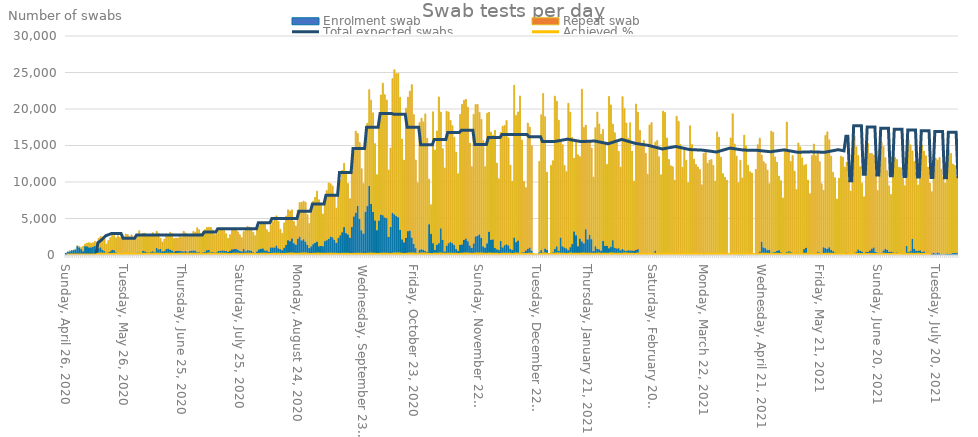
| Category | Enrolment swab | Repeat swab |
|---|---|---|
| 2020-04-26 | 223 | 0 |
| 2020-04-27 | 414 | 0 |
| 2020-04-28 | 518 | 5 |
| 2020-04-29 | 583 | 0 |
| 2020-04-30 | 655 | 0 |
| 2020-05-01 | 751 | 13 |
| 2020-05-02 | 1212 | 66 |
| 2020-05-03 | 1027 | 162 |
| 2020-05-04 | 804 | 214 |
| 2020-05-05 | 512 | 703 |
| 2020-05-06 | 1188 | 330 |
| 2020-05-07 | 1175 | 459 |
| 2020-05-08 | 1040 | 650 |
| 2020-05-09 | 1035 | 589 |
| 2020-05-10 | 1088 | 581 |
| 2020-05-11 | 1241 | 643 |
| 2020-05-12 | 614 | 1059 |
| 2020-05-13 | 918 | 1367 |
| 2020-05-14 | 1049 | 1489 |
| 2020-05-15 | 721 | 1739 |
| 2020-05-16 | 532 | 1622 |
| 2020-05-17 | 222 | 1270 |
| 2020-05-18 | 347 | 1622 |
| 2020-05-19 | 485 | 1894 |
| 2020-05-20 | 686 | 2251 |
| 2020-05-21 | 643 | 2018 |
| 2020-05-22 | 356 | 2006 |
| 2020-05-23 | 212 | 2442 |
| 2020-05-24 | 280 | 2123 |
| 2020-05-25 | 248 | 2157 |
| 2020-05-26 | 152 | 2306 |
| 2020-05-27 | 135 | 2749 |
| 2020-05-28 | 173 | 2625 |
| 2020-05-29 | 148 | 2360 |
| 2020-05-30 | 78 | 2680 |
| 2020-05-31 | 47 | 2282 |
| 2020-06-01 | 257 | 2071 |
| 2020-06-02 | 321 | 2353 |
| 2020-06-03 | 316 | 3009 |
| 2020-06-04 | 215 | 2571 |
| 2020-06-05 | 555 | 2410 |
| 2020-06-06 | 475 | 2525 |
| 2020-06-07 | 360 | 2303 |
| 2020-06-08 | 315 | 2445 |
| 2020-06-09 | 405 | 2382 |
| 2020-06-10 | 507 | 2539 |
| 2020-06-11 | 386 | 2195 |
| 2020-06-12 | 951 | 2302 |
| 2020-06-13 | 769 | 2185 |
| 2020-06-14 | 836 | 1446 |
| 2020-06-15 | 505 | 1272 |
| 2020-06-16 | 537 | 1629 |
| 2020-06-17 | 800 | 2066 |
| 2020-06-18 | 869 | 1928 |
| 2020-06-19 | 727 | 2388 |
| 2020-06-20 | 602 | 2306 |
| 2020-06-21 | 457 | 1792 |
| 2020-06-22 | 558 | 1776 |
| 2020-06-23 | 564 | 1751 |
| 2020-06-24 | 570 | 1988 |
| 2020-06-25 | 517 | 1921 |
| 2020-06-26 | 475 | 2770 |
| 2020-06-27 | 560 | 2446 |
| 2020-06-28 | 370 | 2177 |
| 2020-06-29 | 542 | 2066 |
| 2020-06-30 | 585 | 2280 |
| 2020-07-01 | 609 | 2624 |
| 2020-07-02 | 594 | 2541 |
| 2020-07-03 | 414 | 3314 |
| 2020-07-04 | 435 | 3031 |
| 2020-07-05 | 274 | 2722 |
| 2020-07-06 | 356 | 2819 |
| 2020-07-07 | 429 | 3031 |
| 2020-07-08 | 640 | 3138 |
| 2020-07-09 | 671 | 3120 |
| 2020-07-10 | 416 | 3357 |
| 2020-07-11 | 400 | 3032 |
| 2020-07-12 | 330 | 2449 |
| 2020-07-13 | 372 | 2567 |
| 2020-07-14 | 587 | 2726 |
| 2020-07-15 | 578 | 3039 |
| 2020-07-16 | 624 | 2998 |
| 2020-07-17 | 594 | 2733 |
| 2020-07-18 | 569 | 2334 |
| 2020-07-19 | 417 | 1867 |
| 2020-07-20 | 590 | 2194 |
| 2020-07-21 | 766 | 2752 |
| 2020-07-22 | 792 | 2768 |
| 2020-07-23 | 828 | 2764 |
| 2020-07-24 | 714 | 2464 |
| 2020-07-25 | 543 | 2241 |
| 2020-07-26 | 483 | 1896 |
| 2020-07-27 | 821 | 2381 |
| 2020-07-28 | 511 | 2936 |
| 2020-07-29 | 641 | 3287 |
| 2020-07-30 | 630 | 3205 |
| 2020-07-31 | 578 | 3121 |
| 2020-08-01 | 381 | 2746 |
| 2020-08-02 | 252 | 2392 |
| 2020-08-03 | 477 | 3153 |
| 2020-08-04 | 753 | 3277 |
| 2020-08-05 | 851 | 3605 |
| 2020-08-06 | 880 | 3540 |
| 2020-08-07 | 621 | 3759 |
| 2020-08-08 | 615 | 2837 |
| 2020-08-09 | 445 | 2671 |
| 2020-08-10 | 1042 | 3107 |
| 2020-08-11 | 1030 | 3527 |
| 2020-08-12 | 1026 | 4162 |
| 2020-08-13 | 1298 | 4067 |
| 2020-08-14 | 918 | 3669 |
| 2020-08-15 | 800 | 2733 |
| 2020-08-16 | 665 | 2295 |
| 2020-08-17 | 992 | 3408 |
| 2020-08-18 | 1359 | 3987 |
| 2020-08-19 | 2019 | 4164 |
| 2020-08-20 | 1892 | 4144 |
| 2020-08-21 | 2249 | 3933 |
| 2020-08-22 | 1613 | 2985 |
| 2020-08-23 | 1393 | 2591 |
| 2020-08-24 | 2215 | 3917 |
| 2020-08-25 | 2516 | 4675 |
| 2020-08-26 | 1989 | 5229 |
| 2020-08-27 | 2160 | 5213 |
| 2020-08-28 | 1833 | 5408 |
| 2020-08-29 | 1372 | 4140 |
| 2020-08-30 | 938 | 3372 |
| 2020-08-31 | 1183 | 4604 |
| 2020-09-01 | 1476 | 5919 |
| 2020-09-02 | 1640 | 6257 |
| 2020-09-03 | 1809 | 6929 |
| 2020-09-04 | 1186 | 6375 |
| 2020-09-05 | 1241 | 5803 |
| 2020-09-06 | 1200 | 4416 |
| 2020-09-07 | 1889 | 5985 |
| 2020-09-08 | 2030 | 6809 |
| 2020-09-09 | 2208 | 7662 |
| 2020-09-10 | 2523 | 7237 |
| 2020-09-11 | 2419 | 7045 |
| 2020-09-12 | 2072 | 6177 |
| 2020-09-13 | 1648 | 4779 |
| 2020-09-14 | 2317 | 6128 |
| 2020-09-15 | 2695 | 7494 |
| 2020-09-16 | 3114 | 8491 |
| 2020-09-17 | 3814 | 8763 |
| 2020-09-18 | 2992 | 8512 |
| 2020-09-19 | 2809 | 6977 |
| 2020-09-20 | 2357 | 5362 |
| 2020-09-21 | 3823 | 7646 |
| 2020-09-22 | 5268 | 8980 |
| 2020-09-23 | 5781 | 11190 |
| 2020-09-24 | 6723 | 9915 |
| 2020-09-25 | 4922 | 10493 |
| 2020-09-26 | 3375 | 8451 |
| 2020-09-27 | 2922 | 6871 |
| 2020-09-28 | 5922 | 9631 |
| 2020-09-29 | 6689 | 11348 |
| 2020-09-30 | 9441 | 13204 |
| 2020-10-01 | 6983 | 14227 |
| 2020-10-02 | 5880 | 13598 |
| 2020-10-03 | 4728 | 10528 |
| 2020-10-04 | 3398 | 7606 |
| 2020-10-05 | 4701 | 13215 |
| 2020-10-06 | 5512 | 16415 |
| 2020-10-07 | 5445 | 18097 |
| 2020-10-08 | 5141 | 16826 |
| 2020-10-09 | 5046 | 16195 |
| 2020-10-10 | 2466 | 9171 |
| 2020-10-11 | 3833 | 10824 |
| 2020-10-12 | 5784 | 18380 |
| 2020-10-13 | 5574 | 19805 |
| 2020-10-14 | 5324 | 19500 |
| 2020-10-15 | 5165 | 19709 |
| 2020-10-16 | 3431 | 18171 |
| 2020-10-17 | 2137 | 13741 |
| 2020-10-18 | 1728 | 11257 |
| 2020-10-19 | 2337 | 17780 |
| 2020-10-20 | 3266 | 18367 |
| 2020-10-21 | 3336 | 19104 |
| 2020-10-22 | 2376 | 20961 |
| 2020-10-23 | 1505 | 17734 |
| 2020-10-24 | 927 | 12073 |
| 2020-10-25 | 281 | 9604 |
| 2020-10-26 | 714 | 17430 |
| 2020-10-27 | 781 | 17966 |
| 2020-10-28 | 703 | 17536 |
| 2020-10-29 | 554 | 18780 |
| 2020-10-30 | 410 | 15584 |
| 2020-10-31 | 4200 | 6192 |
| 2020-11-01 | 2903 | 3974 |
| 2020-11-02 | 1611 | 18003 |
| 2020-11-03 | 698 | 13689 |
| 2020-11-04 | 1394 | 15592 |
| 2020-11-05 | 1608 | 20051 |
| 2020-11-06 | 3637 | 15940 |
| 2020-11-07 | 2061 | 12489 |
| 2020-11-08 | 472 | 11452 |
| 2020-11-09 | 1275 | 18416 |
| 2020-11-10 | 1603 | 17992 |
| 2020-11-11 | 1808 | 16618 |
| 2020-11-12 | 1618 | 16104 |
| 2020-11-13 | 1361 | 14743 |
| 2020-11-14 | 806 | 13291 |
| 2020-11-15 | 560 | 10572 |
| 2020-11-16 | 1384 | 17872 |
| 2020-11-17 | 1439 | 19179 |
| 2020-11-18 | 2061 | 19124 |
| 2020-11-19 | 2238 | 19085 |
| 2020-11-20 | 1881 | 18369 |
| 2020-11-21 | 1280 | 14044 |
| 2020-11-22 | 955 | 11138 |
| 2020-11-23 | 1570 | 17712 |
| 2020-11-24 | 2531 | 18082 |
| 2020-11-25 | 2651 | 17985 |
| 2020-11-26 | 2825 | 16731 |
| 2020-11-27 | 2352 | 16232 |
| 2020-11-28 | 1165 | 14491 |
| 2020-11-29 | 998 | 11099 |
| 2020-11-30 | 1590 | 17816 |
| 2020-12-01 | 3174 | 16370 |
| 2020-12-02 | 2082 | 14770 |
| 2020-12-03 | 2120 | 14281 |
| 2020-12-04 | 969 | 16104 |
| 2020-12-05 | 781 | 11818 |
| 2020-12-06 | 671 | 9762 |
| 2020-12-07 | 1912 | 14887 |
| 2020-12-08 | 1030 | 16618 |
| 2020-12-09 | 1341 | 16388 |
| 2020-12-10 | 1461 | 16963 |
| 2020-12-11 | 1321 | 14726 |
| 2020-12-12 | 842 | 11473 |
| 2020-12-13 | 702 | 9406 |
| 2020-12-14 | 2378 | 20880 |
| 2020-12-15 | 1754 | 17363 |
| 2020-12-16 | 1967 | 17639 |
| 2020-12-17 | 117 | 21669 |
| 2020-12-18 | 363 | 15393 |
| 2020-12-19 | 361 | 9718 |
| 2020-12-20 | 611 | 8608 |
| 2020-12-21 | 836 | 17246 |
| 2020-12-22 | 1015 | 16508 |
| 2020-12-23 | 578 | 14388 |
| 2020-12-24 | 0 | 0 |
| 2020-12-25 | 0 | 0 |
| 2020-12-26 | 0 | 0 |
| 2020-12-27 | 356 | 12472 |
| 2020-12-28 | 670 | 18542 |
| 2020-12-29 | 355 | 21761 |
| 2020-12-30 | 872 | 18067 |
| 2020-12-31 | 675 | 10681 |
| 2021-01-01 | 0 | 0 |
| 2021-01-02 | 124 | 12150 |
| 2021-01-03 | 353 | 12553 |
| 2021-01-04 | 815 | 20947 |
| 2021-01-05 | 1166 | 19903 |
| 2021-01-06 | 550 | 17916 |
| 2021-01-07 | 2381 | 13217 |
| 2021-01-08 | 1183 | 13919 |
| 2021-01-09 | 1036 | 11221 |
| 2021-01-10 | 903 | 10508 |
| 2021-01-11 | 658 | 20122 |
| 2021-01-12 | 1059 | 18511 |
| 2021-01-13 | 1492 | 14624 |
| 2021-01-14 | 3213 | 10039 |
| 2021-01-15 | 2690 | 13038 |
| 2021-01-16 | 1203 | 12525 |
| 2021-01-17 | 2235 | 11241 |
| 2021-01-18 | 1843 | 20878 |
| 2021-01-19 | 1582 | 15889 |
| 2021-01-20 | 3514 | 14294 |
| 2021-01-21 | 2124 | 13435 |
| 2021-01-22 | 2777 | 12760 |
| 2021-01-23 | 2161 | 12488 |
| 2021-01-24 | 533 | 10138 |
| 2021-01-25 | 1197 | 16237 |
| 2021-01-26 | 844 | 18748 |
| 2021-01-27 | 768 | 17183 |
| 2021-01-28 | 588 | 15944 |
| 2021-01-29 | 1904 | 15296 |
| 2021-01-30 | 1253 | 14008 |
| 2021-01-31 | 1246 | 11161 |
| 2021-02-01 | 922 | 20797 |
| 2021-02-02 | 1125 | 19437 |
| 2021-02-03 | 2013 | 15929 |
| 2021-02-04 | 999 | 15744 |
| 2021-02-05 | 891 | 14504 |
| 2021-02-06 | 929 | 13263 |
| 2021-02-07 | 659 | 11370 |
| 2021-02-08 | 828 | 20860 |
| 2021-02-09 | 641 | 19428 |
| 2021-02-10 | 545 | 17537 |
| 2021-02-11 | 647 | 15316 |
| 2021-02-12 | 618 | 17506 |
| 2021-02-13 | 602 | 13617 |
| 2021-02-14 | 581 | 9527 |
| 2021-02-15 | 682 | 20011 |
| 2021-02-16 | 794 | 18764 |
| 2021-02-17 | 298 | 16774 |
| 2021-02-18 | 47 | 14977 |
| 2021-02-19 | 152 | 15548 |
| 2021-02-20 | 78 | 13849 |
| 2021-02-21 | 48 | 11019 |
| 2021-02-22 | 93 | 17712 |
| 2021-02-23 | 148 | 17997 |
| 2021-02-24 | 331 | 14340 |
| 2021-02-25 | 591 | 14891 |
| 2021-02-26 | 146 | 15541 |
| 2021-02-27 | 0 | 13456 |
| 2021-02-28 | 0 | 10977 |
| 2021-03-01 | 232 | 19487 |
| 2021-03-02 | 215 | 19313 |
| 2021-03-03 | 219 | 15812 |
| 2021-03-04 | 155 | 12931 |
| 2021-03-05 | 168 | 12043 |
| 2021-03-06 | 91 | 11997 |
| 2021-03-07 | 49 | 10194 |
| 2021-03-08 | 106 | 18894 |
| 2021-03-09 | 102 | 18171 |
| 2021-03-10 | 45 | 15082 |
| 2021-03-11 | 84 | 11922 |
| 2021-03-12 | 30 | 14753 |
| 2021-03-13 | 17 | 12989 |
| 2021-03-14 | 24 | 9876 |
| 2021-03-15 | 21 | 17675 |
| 2021-03-16 | 12 | 15113 |
| 2021-03-17 | 14 | 13123 |
| 2021-03-18 | 29 | 12359 |
| 2021-03-19 | 8 | 12038 |
| 2021-03-20 | 1 | 11708 |
| 2021-03-21 | 0 | 9616 |
| 2021-03-22 | 26 | 13897 |
| 2021-03-23 | 0 | 14095 |
| 2021-03-24 | 0 | 12558 |
| 2021-03-25 | 0 | 12972 |
| 2021-03-26 | 0 | 13080 |
| 2021-03-27 | 0 | 12273 |
| 2021-03-28 | 0 | 10112 |
| 2021-03-29 | 0 | 16864 |
| 2021-03-30 | 0 | 16131 |
| 2021-03-31 | 0 | 13405 |
| 2021-04-01 | 0 | 11143 |
| 2021-04-02 | 0 | 10653 |
| 2021-04-03 | 0 | 10225 |
| 2021-04-04 | 0 | 0 |
| 2021-04-05 | 0 | 16028 |
| 2021-04-06 | 0 | 19343 |
| 2021-04-07 | 128 | 15074 |
| 2021-04-08 | 55 | 13501 |
| 2021-04-09 | 6 | 9893 |
| 2021-04-10 | 20 | 12962 |
| 2021-04-11 | 2 | 10548 |
| 2021-04-12 | 38 | 16396 |
| 2021-04-13 | 73 | 14872 |
| 2021-04-14 | 280 | 12017 |
| 2021-04-15 | 245 | 11152 |
| 2021-04-16 | 132 | 11097 |
| 2021-04-17 | 0 | 0 |
| 2021-04-18 | 26 | 11698 |
| 2021-04-19 | 61 | 15058 |
| 2021-04-20 | 464 | 15538 |
| 2021-04-21 | 1813 | 11885 |
| 2021-04-22 | 1025 | 11765 |
| 2021-04-23 | 930 | 11564 |
| 2021-04-24 | 655 | 10966 |
| 2021-04-25 | 711 | 9066 |
| 2021-04-26 | 296 | 16670 |
| 2021-04-27 | 377 | 16433 |
| 2021-04-28 | 403 | 13038 |
| 2021-04-29 | 562 | 12163 |
| 2021-04-30 | 639 | 10181 |
| 2021-05-01 | 357 | 9812 |
| 2021-05-02 | 210 | 7606 |
| 2021-05-03 | 134 | 14098 |
| 2021-05-04 | 405 | 17802 |
| 2021-05-05 | 521 | 13745 |
| 2021-05-06 | 457 | 12344 |
| 2021-05-07 | 311 | 13311 |
| 2021-05-08 | 126 | 11358 |
| 2021-05-09 | 94 | 8872 |
| 2021-05-10 | 318 | 15027 |
| 2021-05-11 | 204 | 14604 |
| 2021-05-12 | 243 | 13058 |
| 2021-05-13 | 802 | 11488 |
| 2021-05-14 | 983 | 11404 |
| 2021-05-15 | 217 | 10047 |
| 2021-05-16 | 245 | 8153 |
| 2021-05-17 | 156 | 13461 |
| 2021-05-18 | 129 | 15071 |
| 2021-05-19 | 169 | 13430 |
| 2021-05-20 | 462 | 13634 |
| 2021-05-21 | 354 | 12436 |
| 2021-05-22 | 147 | 9625 |
| 2021-05-23 | 1058 | 7797 |
| 2021-05-24 | 940 | 15442 |
| 2021-05-25 | 830 | 16044 |
| 2021-05-26 | 1049 | 14731 |
| 2021-05-27 | 678 | 12868 |
| 2021-05-28 | 502 | 10832 |
| 2021-05-29 | 322 | 10271 |
| 2021-05-30 | 132 | 7537 |
| 2021-05-31 | 145 | 10358 |
| 2021-06-01 | 181 | 13357 |
| 2021-06-02 | 147 | 13248 |
| 2021-06-03 | 237 | 11801 |
| 2021-06-04 | 324 | 12382 |
| 2021-06-05 | 221 | 9983 |
| 2021-06-06 | 216 | 8537 |
| 2021-06-07 | 288 | 14151 |
| 2021-06-08 | 323 | 16000 |
| 2021-06-09 | 459 | 14367 |
| 2021-06-10 | 747 | 12880 |
| 2021-06-11 | 566 | 11526 |
| 2021-06-12 | 458 | 9367 |
| 2021-06-13 | 194 | 7784 |
| 2021-06-14 | 385 | 13316 |
| 2021-06-15 | 405 | 14898 |
| 2021-06-16 | 603 | 13302 |
| 2021-06-17 | 870 | 13036 |
| 2021-06-18 | 1018 | 12646 |
| 2021-06-19 | 426 | 10557 |
| 2021-06-20 | 339 | 8509 |
| 2021-06-21 | 284 | 14194 |
| 2021-06-22 | 325 | 15171 |
| 2021-06-23 | 599 | 14255 |
| 2021-06-24 | 839 | 12482 |
| 2021-06-25 | 684 | 10874 |
| 2021-06-26 | 422 | 9055 |
| 2021-06-27 | 450 | 7830 |
| 2021-06-28 | 348 | 12270 |
| 2021-06-29 | 259 | 13147 |
| 2021-06-30 | 331 | 12749 |
| 2021-07-01 | 0 | 12016 |
| 2021-07-02 | 0 | 11946 |
| 2021-07-03 | 236 | 10282 |
| 2021-07-04 | 153 | 9338 |
| 2021-07-05 | 1229 | 13142 |
| 2021-07-06 | 398 | 15389 |
| 2021-07-07 | 569 | 14512 |
| 2021-07-08 | 2215 | 12032 |
| 2021-07-09 | 843 | 11945 |
| 2021-07-10 | 594 | 10821 |
| 2021-07-11 | 562 | 9031 |
| 2021-07-12 | 627 | 13104 |
| 2021-07-13 | 395 | 14653 |
| 2021-07-14 | 475 | 13750 |
| 2021-07-15 | 271 | 13325 |
| 2021-07-16 | 292 | 11746 |
| 2021-07-17 | 233 | 9624 |
| 2021-07-18 | 185 | 8488 |
| 2021-07-19 | 281 | 11749 |
| 2021-07-20 | 179 | 13086 |
| 2021-07-21 | 336 | 12674 |
| 2021-07-22 | 217 | 13145 |
| 2021-07-23 | 112 | 11657 |
| 2021-07-24 | 60 | 10700 |
| 2021-07-25 | 99 | 9755 |
| 2021-07-26 | 168 | 13191 |
| 2021-07-27 | 128 | 14238 |
| 2021-07-28 | 159 | 13740 |
| 2021-07-29 | 254 | 12209 |
| 2021-07-30 | 262 | 12003 |
| 2021-07-31 | 255 | 10527 |